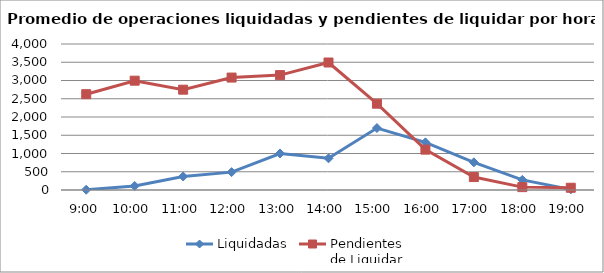
| Category | Liquidadas | Pendientes
de Liquidar |
|---|---|---|
| 0.375 | 7.333 | 2625 |
| 0.4166666666666667 | 110.571 | 2994.952 |
| 0.4583333333333333 | 370.714 | 2748.381 |
| 0.5 | 489.333 | 3080.476 |
| 0.5416666666666666 | 1000.19 | 3148.048 |
| 0.583333333333333 | 868.381 | 3493.048 |
| 0.625 | 1697.381 | 2364.333 |
| 0.666666666666667 | 1305.429 | 1105.81 |
| 0.708333333333333 | 757.667 | 354.095 |
| 0.75 | 276.571 | 78.762 |
| 0.791666666666667 | 16.714 | 61.619 |